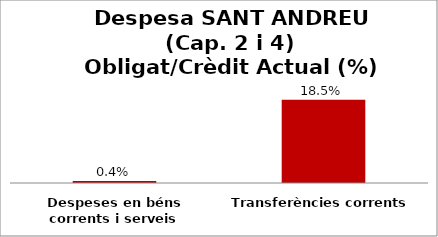
| Category | Series 0 |
|---|---|
| Despeses en béns corrents i serveis | 0.004 |
| Transferències corrents | 0.185 |